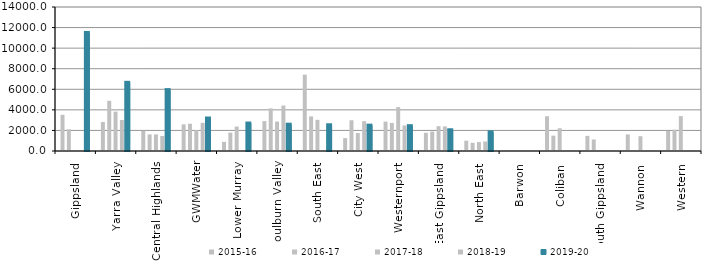
| Category | 2015-16 | 2016-17 | 2017-18 | 2018-19 | 2019-20 |
|---|---|---|---|---|---|
| Gippsland  | 3517.99 | 2111.76 | 0 | 0 | 11477.84 |
| Yarra Valley  | 2816.45 | 4881 | 3829 | 3012.66 | 6628 |
| Central Highlands  | 1972 | 1613 | 1613 | 1460 | 5920 |
| GWMWater | 2590 | 2649.559 | 2034.195 | 2740 | 3159.116 |
| Lower Murray  | 891.993 | 1788 | 2371.45 | 0 | 2671 |
| Goulburn Valley  | 2908 | 4141 | 2860 | 4420.53 | 2557.45 |
| South East  | 7425 | 3364 | 3030 | 0 | 2501 |
| City West  | 1253.02 | 2988.35 | 1747 | 2899.296 | 2464.667 |
| Westernport  | 2859 | 2728 | 4270 | 2483 | 2414 |
| East Gippsland  | 1773 | 1888 | 2412 | 2388 | 2016.18 |
| North East  | 1003.51 | 796.33 | 871 | 926.51 | 1813.93 |
| Barwon  | 0 | 0 | 0 | 0 | 0 |
| Coliban  | 3379 | 1493 | 2211.56 | 0 | 0 |
| South Gippsland  | 1470 | 1123.4 | 0 | 0 | 0 |
| Wannon  | 1612 | 0 | 1437 | 0 | 0 |
| Western  | 1957 | 2065 | 3390 | 0 | 0 |